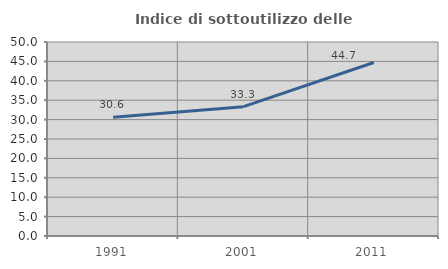
| Category | Indice di sottoutilizzo delle abitazioni  |
|---|---|
| 1991.0 | 30.596 |
| 2001.0 | 33.333 |
| 2011.0 | 44.72 |